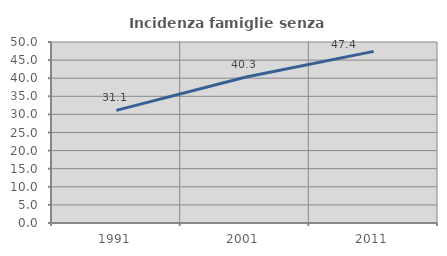
| Category | Incidenza famiglie senza nuclei |
|---|---|
| 1991.0 | 31.124 |
| 2001.0 | 40.275 |
| 2011.0 | 47.409 |